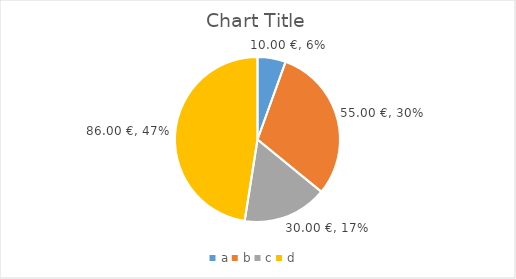
| Category | Series 0 |
|---|---|
| a | 10 |
| b | 55 |
| c | 30 |
| d | 86 |